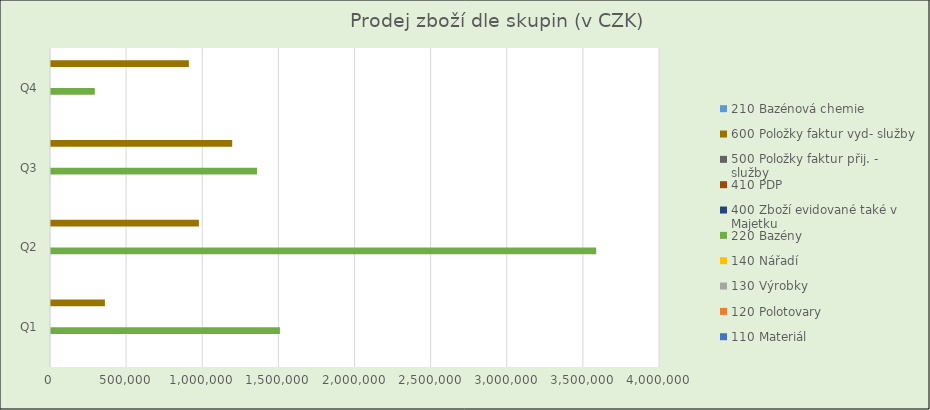
| Category | 110 | 120 | 130 | 140 | 220 | 400 | 410 | 500 | 600 | 210 |
|---|---|---|---|---|---|---|---|---|---|---|
| Q1 | 0 | 0 | 0 | 0 | 1503700 | 0 | 0 | 0 | 354070 | 0 |
| Q2 | 0 | 0 | 0 | 0 | 3581100 | 0 | 0 | 0 | 971360 | 0 |
| Q3 | 0 | 0 | 0 | 0 | 1353300 | 0 | 0 | 0 | 1190130 | 0 |
| Q4 | 0 | 0 | 0 | 0 | 287600 | 0 | 0 | 0 | 905540 | 0 |